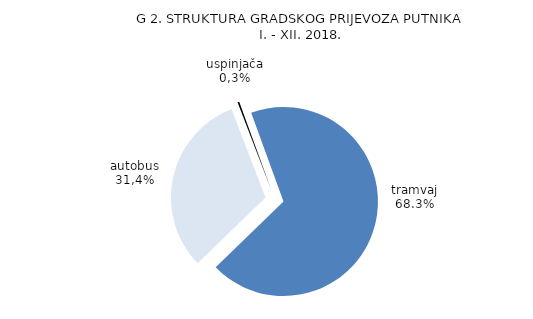
| Category | Series 0 |
|---|---|
| tramvaj | 186693 |
| autobus | 85849 |
| žičara i uspinjača | 800 |